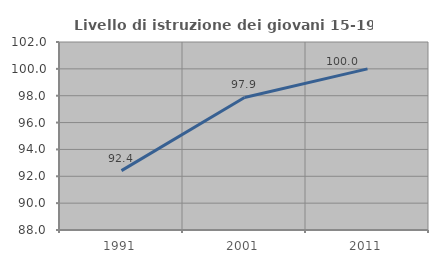
| Category | Livello di istruzione dei giovani 15-19 anni |
|---|---|
| 1991.0 | 92.424 |
| 2001.0 | 97.872 |
| 2011.0 | 100 |